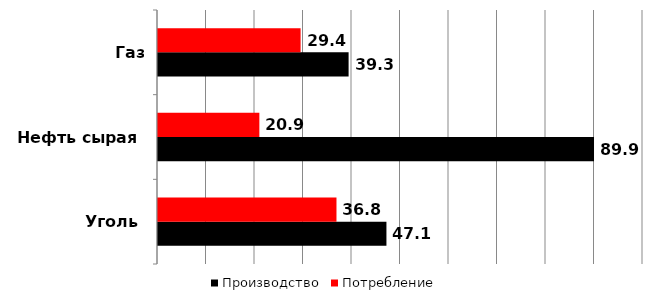
| Category | Производство | Потребление |
|---|---|---|
| Уголь | 47.1 | 36.8 |
| Нефть сырая | 89.9 | 20.9 |
| Газ природный | 39.3 | 29.4 |